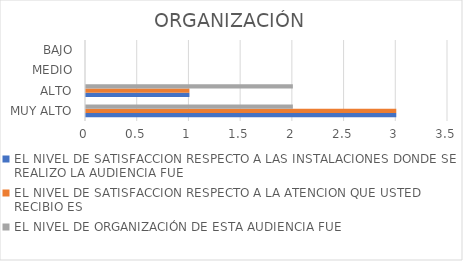
| Category | EL NIVEL DE SATISFACCION RESPECTO A LAS INSTALACIONES DONDE SE REALIZO LA AUDIENCIA FUE | EL NIVEL DE SATISFACCION RESPECTO A LA ATENCION QUE USTED RECIBIO ES | EL NIVEL DE ORGANIZACIÓN DE ESTA AUDIENCIA FUE |
|---|---|---|---|
| MUY ALTO | 3 | 3 | 2 |
| ALTO | 1 | 1 | 2 |
| MEDIO | 0 | 0 | 0 |
| BAJO | 0 | 0 | 0 |